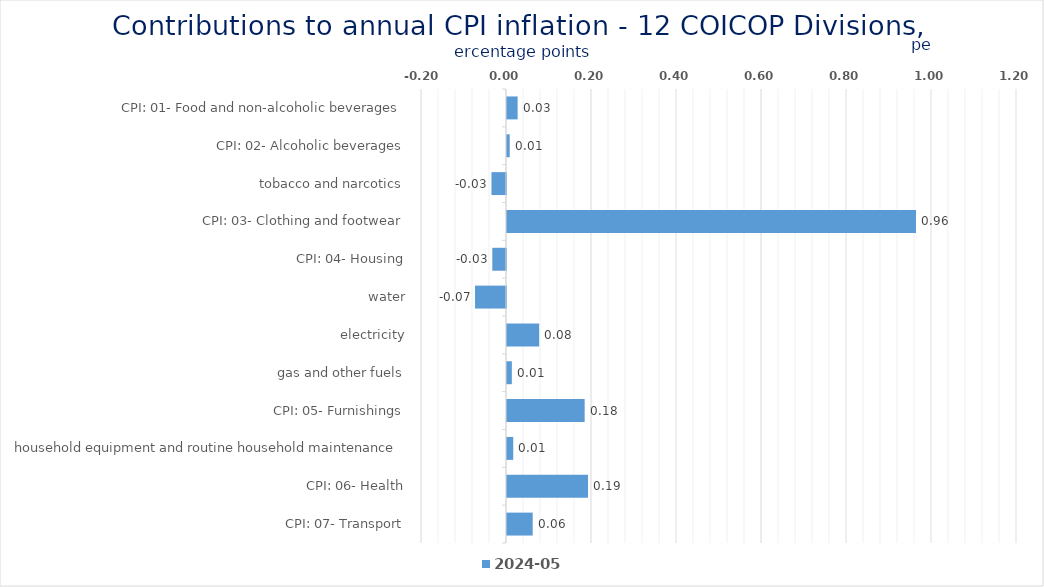
| Category | 2024-05 |
|---|---|
| CPI: 01- Food and non-alcoholic beverages | 0.025 |
| CPI: 02- Alcoholic beverages, tobacco and narcotics | 0.006 |
| CPI: 03- Clothing and footwear | -0.034 |
| CPI: 04- Housing, water, electricity, gas and other fuels | 0.962 |
| CPI: 05- Furnishings, household equipment and routine household maintenance | -0.032 |
| CPI: 06- Health | -0.073 |
| CPI: 07- Transport | 0.076 |
| CPI: 08- Communication | 0.011 |
| CPI: 09- Recreation and culture | 0.183 |
| CPI: 10- Education | 0.015 |
| CPI: 11- Restaurants and hotels | 0.191 |
| CPI: 12- Miscellaneous goods and services | 0.06 |